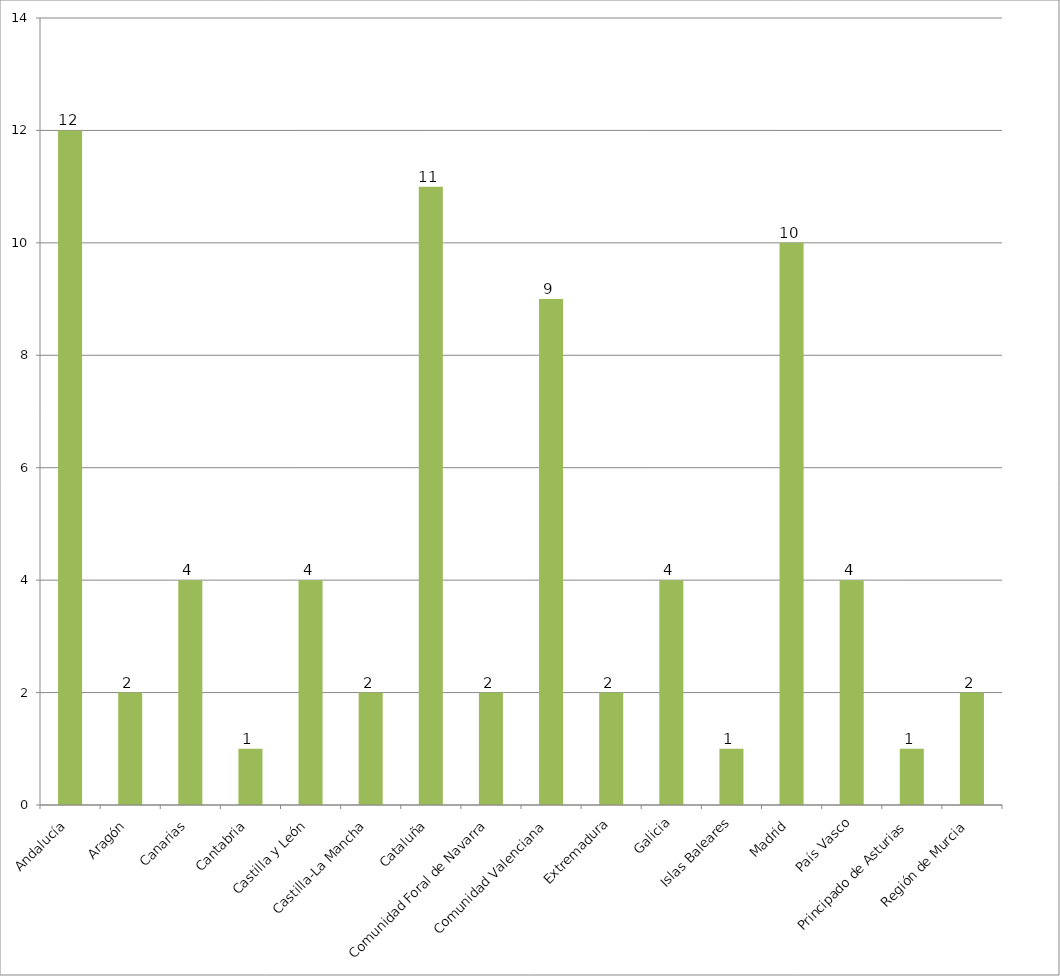
| Category | Total |
|---|---|
| Andalucía | 12 |
| Aragón | 2 |
| Canarias | 4 |
| Cantabria | 1 |
| Castilla y León | 4 |
| Castilla-La Mancha | 2 |
| Cataluña | 11 |
| Comunidad Foral de Navarra | 2 |
| Comunidad Valenciana | 9 |
| Extremadura | 2 |
| Galicia | 4 |
| Islas Baleares | 1 |
| Madrid | 10 |
| País Vasco | 4 |
| Principado de Asturias | 1 |
| Región de Murcia | 2 |